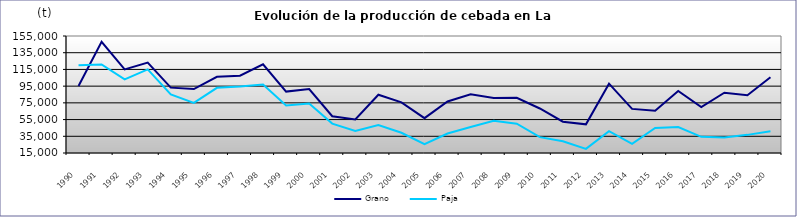
| Category | Grano | Paja |
|---|---|---|
| 1990.0 | 95275 | 120000 |
| 1991.0 | 148112 | 121000 |
| 1992.0 | 115103 | 103000 |
| 1993.0 | 123187 | 115000 |
| 1994.0 | 93210 | 85000 |
| 1995.0 | 91519 | 75000 |
| 1996.0 | 106189 | 93000 |
| 1997.0 | 107527 | 94624 |
| 1998.0 | 121160 | 96928 |
| 1999.0 | 88497 | 71950 |
| 2000.0 | 91546.9 | 74160 |
| 2001.0 | 59037 | 50182 |
| 2002.0 | 55074 | 41306 |
| 2003.0 | 84723 | 48380 |
| 2004.0 | 75526 | 39200 |
| 2005.0 | 56674 | 25500 |
| 2006.0 | 76710 | 38355 |
| 2007.0 | 85375 | 46013 |
| 2008.0 | 80727 | 53500 |
| 2009.0 | 81015 | 50000 |
| 2010.0 | 68243 | 34000 |
| 2011.0 | 52409 | 29000 |
| 2012.0 | 49297 | 19900 |
| 2013.0 | 97975 | 41200 |
| 2014.0 | 67787 | 26000 |
| 2015.0 | 65581 | 45000 |
| 2016.0 | 89276 | 46000 |
| 2017.0 | 69965 | 34300 |
| 2018.0 | 87095 | 33500 |
| 2019.0 | 84021 | 36700 |
| 2020.0 | 105688 | 41000 |